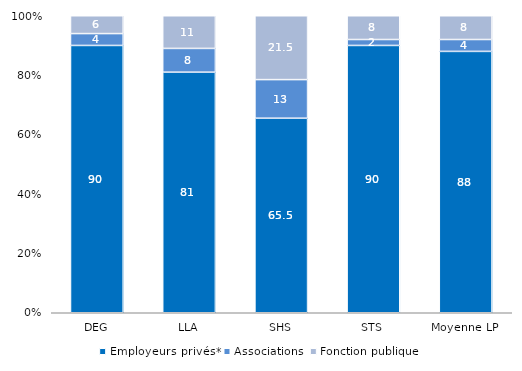
| Category | Employeurs privés* | Associations | Fonction publique |
|---|---|---|---|
| DEG | 90 | 4 | 6 |
| LLA | 81 | 8 | 11 |
| SHS | 65.5 | 13 | 21.5 |
| STS | 90 | 2 | 8 |
| Moyenne LP | 88 | 4 | 8 |